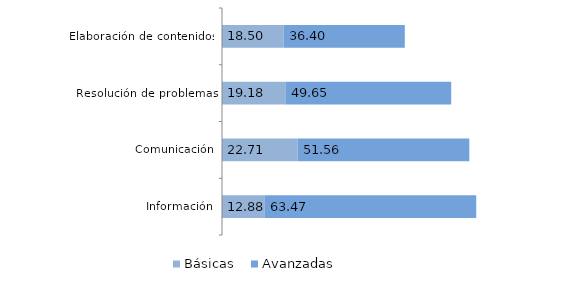
| Category | Básicas | Avanzadas |
|---|---|---|
| Información | 12.88 | 63.47 |
| Comunicación | 22.71 | 51.56 |
| Resolución de problemas | 19.18 | 49.65 |
| Elaboración de contenidos | 18.5 | 36.4 |